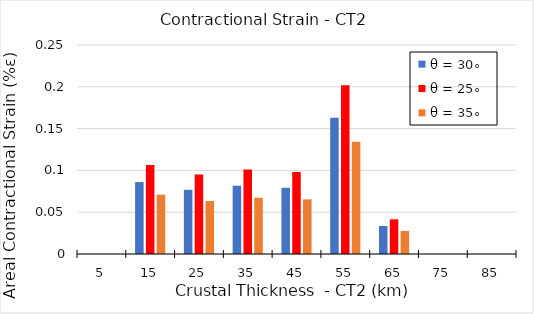
| Category | θ = 30∘ | θ = 25∘ | θ = 35∘ |
|---|---|---|---|
| 5.0 | 0 | 0 | 0 |
| 15.0 | 0.086 | 0.107 | 0.071 |
| 25.0 | 0.077 | 0.095 | 0.063 |
| 35.0 | 0.082 | 0.101 | 0.067 |
| 45.0 | 0.079 | 0.098 | 0.065 |
| 55.0 | 0.163 | 0.202 | 0.134 |
| 65.0 | 0.033 | 0.041 | 0.028 |
| 75.0 | 0 | 0 | 0 |
| 85.0 | 0 | 0 | 0 |